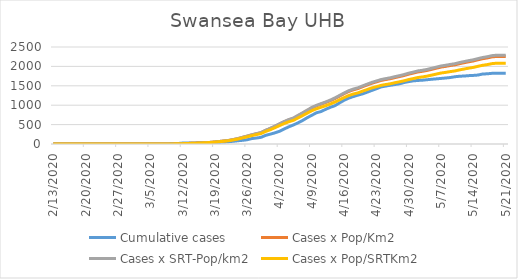
| Category | Cumulative cases | Cases x Pop/Km2 | Cases x SRT-Pop/km2 | Cases x Pop/SRTKm2 |
|---|---|---|---|---|
| 5/21/20 | 1825 | 2257.155 | 2289.032 | 2082.576 |
| 5/20/20 | 1825 | 2257.155 | 2289.032 | 2082.576 |
| 5/19/20 | 1825 | 2256.625 | 2288.495 | 2082.087 |
| 5/18/20 | 1821 | 2244.253 | 2275.948 | 2070.672 |
| 5/17/20 | 1809 | 2217.919 | 2249.242 | 2046.374 |
| 5/16/20 | 1804 | 2198.3 | 2229.346 | 2028.273 |
| 5/15/20 | 1777 | 2170.729 | 2201.386 | 2002.834 |
| 5/14/20 | 1768 | 2140.153 | 2170.378 | 1974.623 |
| 5/13/20 | 1762 | 2118.944 | 2148.869 | 1955.055 |
| 5/12/20 | 1752 | 2094.554 | 2124.134 | 1932.551 |
| 5/11/20 | 1746 | 2070.34 | 2099.579 | 1910.21 |
| 5/10/20 | 1734 | 2040.294 | 2069.109 | 1882.488 |
| 5/9/20 | 1713 | 2022.797 | 2051.364 | 1866.344 |
| 5/8/20 | 1701 | 2000.881 | 2029.139 | 1846.123 |
| 5/7/20 | 1690 | 1983.207 | 2011.215 | 1829.816 |
| 5/6/20 | 1679 | 1954.045 | 1981.641 | 1802.91 |
| 5/5/20 | 1669 | 1924.883 | 1952.067 | 1776.003 |
| 5/4/20 | 1657 | 1896.781 | 1923.569 | 1750.075 |
| 5/3/20 | 1645 | 1874.158 | 1900.626 | 1729.202 |
| 5/2/20 | 1638 | 1857.544 | 1883.778 | 1713.873 |
| 5/1/20 | 1628 | 1828.029 | 1853.846 | 1686.64 |
| 4/30/20 | 1608 | 1800.104 | 1825.526 | 1660.875 |
| 4/29/20 | 1584 | 1766.169 | 1791.113 | 1629.565 |
| 4/28/20 | 1552 | 1737.361 | 1761.897 | 1602.985 |
| 4/27/20 | 1532 | 1711.557 | 1735.728 | 1579.177 |
| 4/26/20 | 1514 | 1682.571 | 1706.334 | 1552.433 |
| 4/25/20 | 1493 | 1661.539 | 1685.005 | 1533.028 |
| 4/24/20 | 1471 | 1637.679 | 1660.808 | 1511.013 |
| 4/23/20 | 1424 | 1601.094 | 1623.706 | 1477.257 |
| 4/22/20 | 1380 | 1566.099 | 1588.217 | 1444.969 |
| 4/21/20 | 1336 | 1521.737 | 1543.228 | 1404.039 |
| 4/20/20 | 1292 | 1477.022 | 1497.881 | 1362.782 |
| 4/19/20 | 1260 | 1428.418 | 1448.591 | 1317.937 |
| 4/18/20 | 1223 | 1396.958 | 1416.687 | 1288.911 |
| 4/17/20 | 1183 | 1354.01 | 1373.133 | 1249.285 |
| 4/16/20 | 1127 | 1297.1 | 1315.418 | 1196.776 |
| 4/15/20 | 1059 | 1233.65 | 1251.072 | 1138.233 |
| 4/14/20 | 987 | 1170.907 | 1187.443 | 1080.343 |
| 4/13/20 | 945 | 1116.117 | 1131.88 | 1029.791 |
| 4/12/20 | 894 | 1068.928 | 1084.024 | 986.252 |
| 4/11/20 | 836 | 1025.98 | 1040.469 | 946.625 |
| 4/10/20 | 805 | 982.855 | 996.735 | 906.836 |
| 4/9/20 | 740 | 929.833 | 942.964 | 857.915 |
| 4/8/20 | 678 | 860.904 | 873.062 | 794.317 |
| 4/7/20 | 606 | 793.212 | 804.414 | 731.861 |
| 4/6/20 | 544 | 726.758 | 737.021 | 670.547 |
| 4/5/20 | 490 | 659.773 | 669.091 | 608.743 |
| 4/4/20 | 442 | 620.713 | 629.479 | 572.704 |
| 4/3/20 | 387 | 571.049 | 579.114 | 526.881 |
| 4/2/20 | 327 | 513.785 | 521.041 | 474.047 |
| 4/1/20 | 287 | 454.93 | 461.355 | 419.744 |
| 3/31/20 | 254 | 398.373 | 404 | 367.561 |
| 3/30/20 | 223 | 350.477 | 355.426 | 323.369 |
| 3/29/20 | 172 | 291.445 | 295.561 | 268.904 |
| 3/28/20 | 154 | 263.874 | 267.6 | 243.465 |
| 3/27/20 | 140 | 234.535 | 237.847 | 216.395 |
| 3/26/20 | 110 | 201.838 | 204.688 | 186.227 |
| 3/25/20 | 95 | 171.085 | 173.501 | 157.852 |
| 3/24/20 | 84 | 138.741 | 140.701 | 128.01 |
| 3/23/20 | 70 | 114.881 | 116.504 | 105.996 |
| 3/22/20 | 60 | 91.905 | 93.203 | 84.797 |
| 3/21/20 | 52 | 78.473 | 79.581 | 72.403 |
| 3/20/20 | 47 | 65.217 | 66.138 | 60.173 |
| 3/19/20 | 41 | 52.492 | 53.233 | 48.432 |
| 3/18/20 | 36 | 41.888 | 42.479 | 38.648 |
| 3/17/20 | 33 | 35.702 | 36.206 | 32.94 |
| 3/16/20 | 31 | 29.162 | 29.574 | 26.907 |
| 3/15/20 | 29 | 23.153 | 23.48 | 21.362 |
| 3/14/20 | 28 | 18.028 | 18.282 | 16.633 |
| 3/13/20 | 28 | 14.669 | 14.877 | 13.535 |
| 3/12/20 | 24 | 9.897 | 10.037 | 9.132 |
| 3/11/20 | 13 | 5.656 | 5.736 | 5.218 |
| 3/10/20 | 9 | 3.181 | 3.226 | 2.935 |
| 3/9/20 | 2 | 1.237 | 1.255 | 1.141 |
| 3/8/20 | 2 | 0.707 | 0.717 | 0.652 |
| 3/7/20 | 2 | 0.707 | 0.717 | 0.652 |
| 3/6/20 | 1 | 0.353 | 0.358 | 0.326 |
| 3/5/20 | 1 | 0.353 | 0.358 | 0.326 |
| 3/4/20 | 1 | 0.353 | 0.358 | 0.326 |
| 3/3/20 | 1 | 0.177 | 0.179 | 0.163 |
| 3/2/20 | 1 | 0.177 | 0.179 | 0.163 |
| 3/1/20 | 1 | 0.177 | 0.179 | 0.163 |
| 2/29/20 | 1 | 0.177 | 0.179 | 0.163 |
| 2/28/20 | 1 | 0.177 | 0.179 | 0.163 |
| 2/27/20 | 1 | 0.177 | 0.179 | 0.163 |
| 2/26/20 | 0 | 0 | 0 | 0 |
| 2/25/20 | 0 | 0 | 0 | 0 |
| 2/24/20 | 0 | 0 | 0 | 0 |
| 2/23/20 | 0 | 0 | 0 | 0 |
| 2/22/20 | 0 | 0 | 0 | 0 |
| 2/21/20 | 0 | 0 | 0 | 0 |
| 2/20/20 | 0 | 0 | 0 | 0 |
| 2/19/20 | 0 | 0 | 0 | 0 |
| 2/18/20 | 0 | 0 | 0 | 0 |
| 2/17/20 | 0 | 0 | 0 | 0 |
| 2/16/20 | 0 | 0 | 0 | 0 |
| 2/15/20 | 0 | 0 | 0 | 0 |
| 2/14/20 | 0 | 0 | 0 | 0 |
| 2/13/20 | 0 | 0 | 0 | 0 |